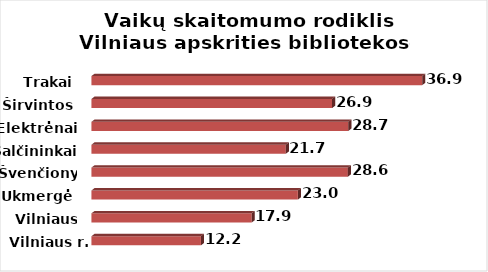
| Category | Series 0 |
|---|---|
| Vilniaus r. | 12.22 |
| Vilniaus m. | 17.89 |
| Ukmergė | 23.04 |
| Švenčionys | 28.62 |
| Šalčininkai | 21.69 |
| Elektrėnai | 28.67 |
| Širvintos | 26.86 |
| Trakai | 36.92 |